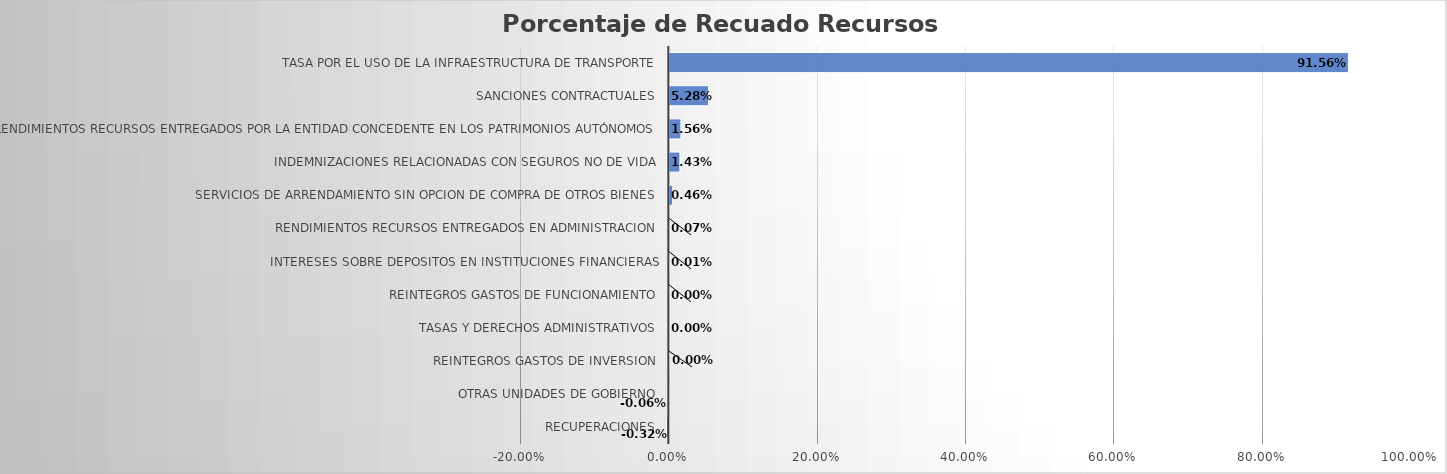
| Category | Total |
|---|---|
| RECUPERACIONES | -0.003 |
| OTRAS UNIDADES DE GOBIERNO | -0.001 |
| REINTEGROS GASTOS DE INVERSION | 0 |
| TASAS Y DERECHOS ADMINISTRATIVOS | 0 |
| REINTEGROS GASTOS DE FUNCIONAMIENTO | 0 |
| INTERESES SOBRE DEPOSITOS EN INSTITUCIONES FINANCIERAS | 0 |
| RENDIMIENTOS RECURSOS ENTREGADOS EN ADMINISTRACION | 0.001 |
| SERVICIOS DE ARRENDAMIENTO SIN OPCION DE COMPRA DE OTROS BIENES | 0.005 |
| INDEMNIZACIONES RELACIONADAS CON SEGUROS NO DE VIDA | 0.014 |
| RENDIMIENTOS RECURSOS ENTREGADOS POR LA ENTIDAD CONCEDENTE EN LOS PATRIMONIOS AUTÓNOMOS | 0.016 |
| SANCIONES CONTRACTUALES | 0.053 |
| TASA POR EL USO DE LA INFRAESTRUCTURA DE TRANSPORTE | 0.916 |